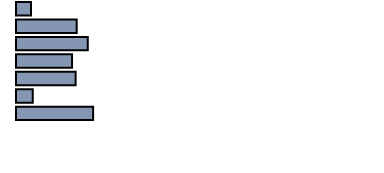
| Category | Series 0 |
|---|---|
| 0 | 4.2 |
| 1 | 17 |
| 2 | 20.1 |
| 3 | 15.7 |
| 4 | 16.7 |
| 5 | 4.7 |
| 6 | 21.6 |
| 7 | 0 |
| 8 | 0 |